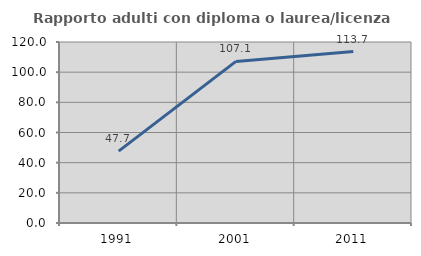
| Category | Rapporto adulti con diploma o laurea/licenza media  |
|---|---|
| 1991.0 | 47.674 |
| 2001.0 | 107.143 |
| 2011.0 | 113.699 |